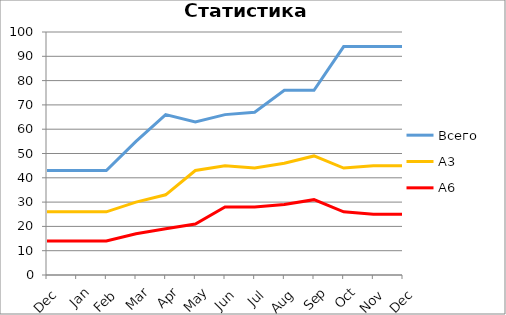
| Category | Всего | А3 | A6 |
|---|---|---|---|
| Dec | 43 | 26 | 14 |
| Jan | 43 | 26 | 14 |
| Feb | 43 | 26 | 14 |
| Mar | 55 | 30 | 17 |
| Apr | 66 | 33 | 19 |
| May | 63 | 43 | 21 |
| Jun | 66 | 45 | 28 |
| Jul | 67 | 44 | 28 |
| Aug | 76 | 46 | 29 |
| Sep | 76 | 49 | 31 |
| Oct | 94 | 44 | 26 |
| Nov | 94 | 45 | 25 |
| Dec | 94 | 45 | 25 |